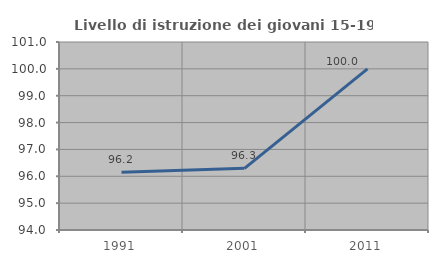
| Category | Livello di istruzione dei giovani 15-19 anni |
|---|---|
| 1991.0 | 96.154 |
| 2001.0 | 96.296 |
| 2011.0 | 100 |